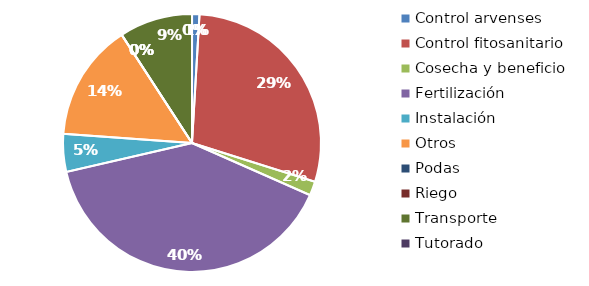
| Category | Valor |
|---|---|
| Control arvenses | 169400 |
| Control fitosanitario | 5282000 |
| Cosecha y beneficio | 320000 |
| Fertilización | 7262600 |
| Instalación | 864000 |
| Otros | 2681000 |
| Podas | 0 |
| Riego | 0 |
| Transporte | 1675000 |
| Tutorado | 0 |